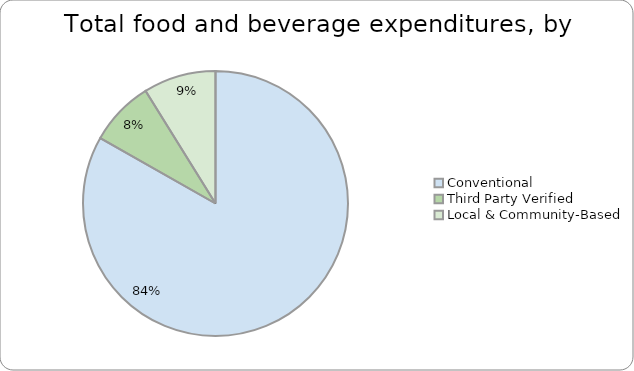
| Category | Series 0 |
|---|---|
| Conventional | 0.832 |
| Third Party Verified | 0.079 |
| Local & Community-Based | 0.088 |